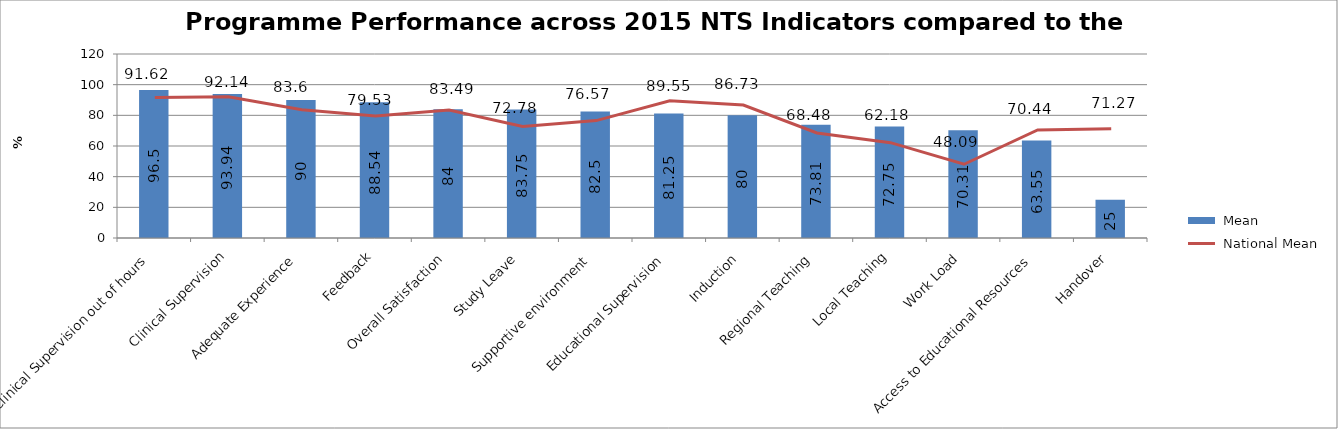
| Category |  Mean |
|---|---|
| Clinical Supervision out of hours | 96.5 |
| Clinical Supervision | 93.94 |
| Adequate Experience | 90 |
| Feedback | 88.54 |
| Overall Satisfaction | 84 |
| Study Leave | 83.75 |
| Supportive environment | 82.5 |
| Educational Supervision | 81.25 |
| Induction | 80 |
| Regional Teaching | 73.81 |
| Local Teaching | 72.75 |
| Work Load | 70.31 |
| Access to Educational Resources | 63.55 |
| Handover | 25 |